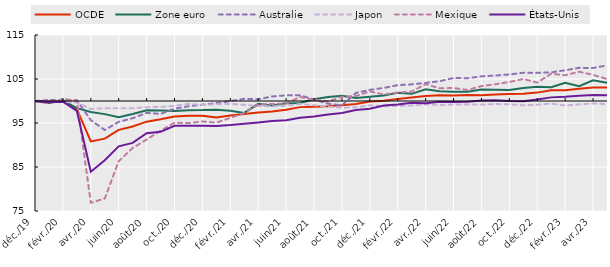
| Category | OCDE | Zone euro | Australie | Japon | Mexique | États-Unis |
|---|---|---|---|---|---|---|
| 2019-12-01 | 100 | 100 | 100 | 100 | 100 | 100 |
| 2020-01-01 | 99.913 | 99.535 | 100.22 | 99.794 | 99.453 | 99.743 |
| 2020-02-01 | 99.902 | 100.158 | 100.192 | 99.764 | 100.468 | 99.831 |
| 2020-03-01 | 98.151 | 98.37 | 100.157 | 99.661 | 100.099 | 97.759 |
| 2020-04-01 | 90.812 | 97.486 | 95.65 | 98.201 | 76.878 | 83.939 |
| 2020-05-01 | 91.453 | 97.019 | 93.409 | 98.364 | 77.842 | 86.521 |
| 2020-06-01 | 93.452 | 96.333 | 95.263 | 98.378 | 86.319 | 89.687 |
| 2020-07-01 | 94.189 | 97.031 | 96.09 | 98.349 | 89.328 | 90.49 |
| 2020-08-01 | 95.309 | 97.893 | 97.296 | 98.585 | 91.239 | 92.665 |
| 2020-09-01 | 95.833 | 97.816 | 97.075 | 98.658 | 93.243 | 92.999 |
| 2020-10-01 | 96.462 | 97.743 | 98.249 | 98.894 | 95.072 | 94.356 |
| 2020-11-01 | 96.62 | 97.923 | 98.803 | 99.351 | 94.972 | 94.382 |
| 2020-12-01 | 96.624 | 97.93 | 99.174 | 99.101 | 95.344 | 94.4 |
| 2021-01-01 | 96.227 | 98.025 | 99.506 | 99.278 | 95.078 | 94.326 |
| 2021-02-01 | 96.727 | 97.763 | 99.987 | 99.351 | 96.169 | 94.531 |
| 2021-03-01 | 97.063 | 97.282 | 100.499 | 99.13 | 97.3 | 94.846 |
| 2021-04-01 | 97.396 | 99.351 | 100.388 | 98.865 | 99.212 | 95.137 |
| 2021-05-01 | 97.613 | 98.975 | 101.031 | 98.806 | 99.328 | 95.469 |
| 2021-06-01 | 98.024 | 99.461 | 101.281 | 98.924 | 99.401 | 95.614 |
| 2021-07-01 | 98.608 | 99.564 | 101.316 | 99.322 | 100.916 | 96.215 |
| 2021-08-01 | 98.713 | 100.406 | 100.322 | 99.042 | 100.302 | 96.479 |
| 2021-09-01 | 98.824 | 100.922 | 99.397 | 98.717 | 99.867 | 96.912 |
| 2021-10-01 | 99.041 | 101.211 | 99.011 | 98.467 | 100.96 | 97.264 |
| 2021-11-01 | 99.342 | 100.681 | 101.825 | 98.57 | 101.134 | 97.948 |
| 2021-12-01 | 99.884 | 100.964 | 102.536 | 99.027 | 102.168 | 98.264 |
| 2022-01-01 | 100.082 | 101.245 | 102.967 | 98.806 | 101.482 | 98.984 |
| 2022-02-01 | 100.482 | 101.861 | 103.599 | 98.85 | 101.919 | 99.227 |
| 2022-03-01 | 100.8 | 101.629 | 103.784 | 98.997 | 102.148 | 99.589 |
| 2022-04-01 | 101.144 | 102.658 | 104.113 | 99.233 | 103.833 | 99.506 |
| 2022-05-01 | 101.283 | 102.195 | 104.497 | 99.086 | 102.889 | 99.824 |
| 2022-06-01 | 101.268 | 102.122 | 105.231 | 99.204 | 102.952 | 99.754 |
| 2022-07-01 | 101.356 | 102.092 | 105.173 | 99.233 | 102.511 | 99.851 |
| 2022-08-01 | 101.279 | 102.621 | 105.607 | 99.189 | 103.382 | 100.09 |
| 2022-09-01 | 101.462 | 102.539 | 105.781 | 99.307 | 103.804 | 100.154 |
| 2022-10-01 | 101.573 | 102.482 | 106.028 | 99.233 | 104.321 | 100.001 |
| 2022-11-01 | 101.648 | 102.939 | 106.425 | 99.027 | 104.996 | 99.941 |
| 2022-12-01 | 101.905 | 103.231 | 106.392 | 99.16 | 104.189 | 100.357 |
| 2023-01-01 | 102.432 | 103.148 | 106.509 | 99.425 | 106.201 | 100.824 |
| 2023-02-01 | 102.462 | 104.153 | 106.988 | 98.983 | 105.848 | 100.954 |
| 2023-03-01 | 102.784 | 103.353 | 107.534 | 99.233 | 106.658 | 101.169 |
| 2023-04-01 | 103.065 | 104.687 | 107.503 | 99.425 | 105.937 | 101.337 |
| 2023-05-01 | 103.059 | 104.148 | 108.089 | 99.307 | 104.99 | 101.288 |